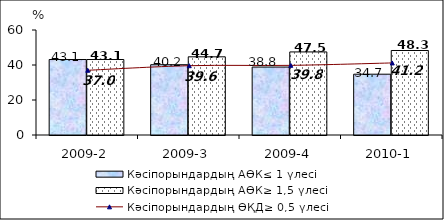
| Category | Кәсіпорындардың АӨК≤ 1 үлесі | Кәсіпорындардың АӨК≥ 1,5 үлесі |
|---|---|---|
| 2009-2 | 43.128 | 43.128 |
| 2009-3 | 40.161 | 44.677 |
| 2009-4 | 38.825 | 47.471 |
| 2010-1 | 34.747 | 48.287 |